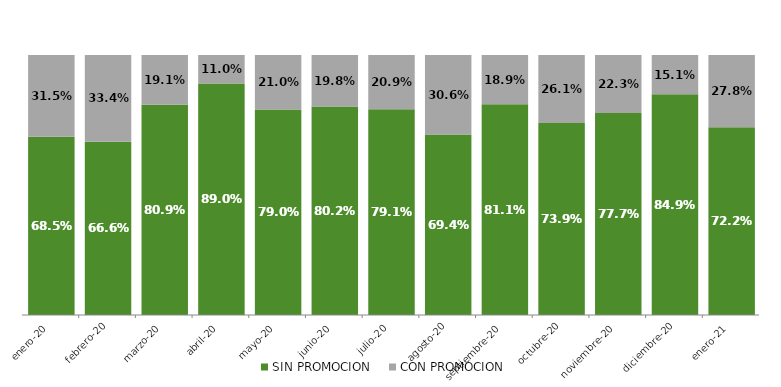
| Category | SIN PROMOCION   | CON PROMOCION   |
|---|---|---|
| 2020-01-01 | 0.685 | 0.315 |
| 2020-02-01 | 0.666 | 0.334 |
| 2020-03-01 | 0.809 | 0.191 |
| 2020-04-01 | 0.89 | 0.11 |
| 2020-05-01 | 0.79 | 0.21 |
| 2020-06-01 | 0.802 | 0.198 |
| 2020-07-01 | 0.791 | 0.209 |
| 2020-08-01 | 0.694 | 0.306 |
| 2020-09-01 | 0.811 | 0.189 |
| 2020-10-01 | 0.739 | 0.261 |
| 2020-11-01 | 0.777 | 0.223 |
| 2020-12-01 | 0.849 | 0.151 |
| 2021-01-01 | 0.722 | 0.278 |